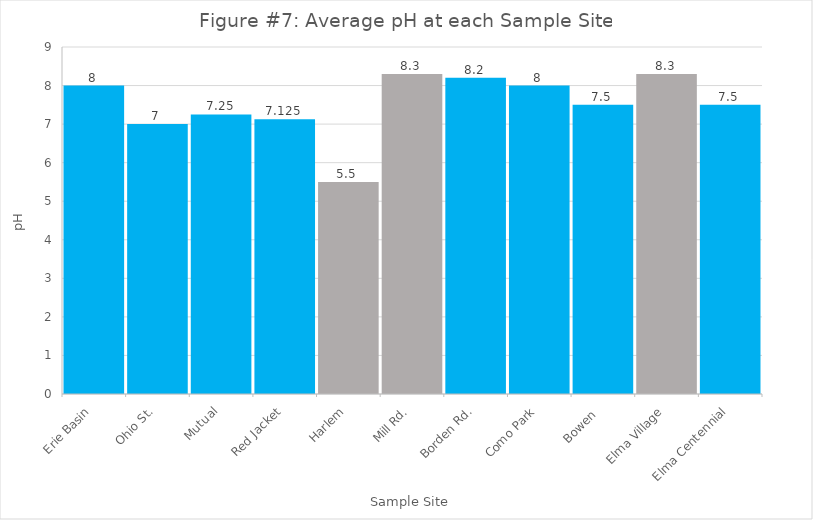
| Category | Series 0 |
|---|---|
| Erie Basin | 8 |
| Ohio St. | 7 |
| Mutual | 7.25 |
| Red Jacket | 7.125 |
| Harlem | 5.5 |
| Mill Rd. | 8.3 |
| Borden Rd. | 8.2 |
| Como Park | 8 |
| Bowen  | 7.5 |
| Elma Village | 8.3 |
| Elma Centennial | 7.5 |